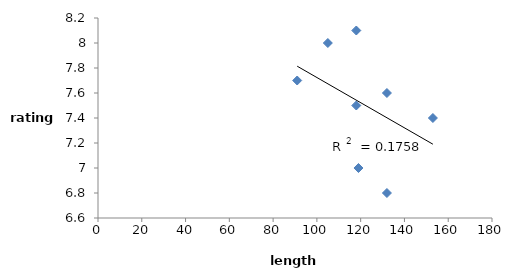
| Category | Series 0 |
|---|---|
| 118.0 | 8.1 |
| 132.0 | 6.8 |
| 119.0 | 7 |
| 153.0 | 7.4 |
| 91.0 | 7.7 |
| 118.0 | 7.5 |
| 132.0 | 7.6 |
| 105.0 | 8 |